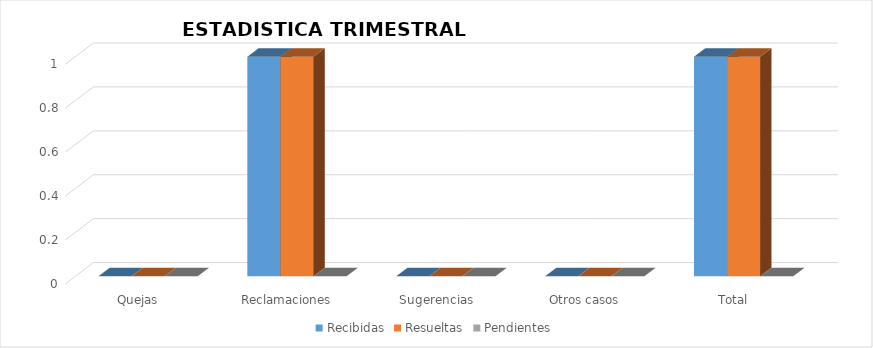
| Category | Recibidas | Resueltas | Pendientes |
|---|---|---|---|
| Quejas | 0 | 0 | 0 |
| Reclamaciones | 1 | 1 | 0 |
| Sugerencias | 0 | 0 | 0 |
| Otros casos | 0 | 0 | 0 |
| Total | 1 | 1 | 0 |